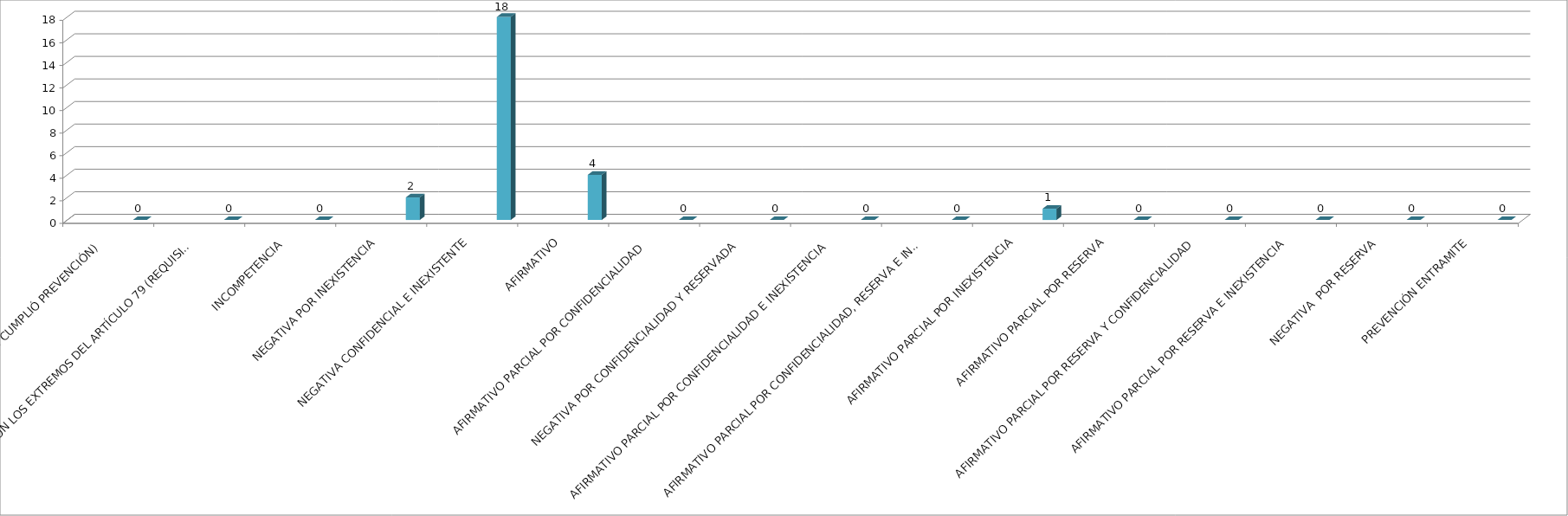
| Category | Series 0 | Series 1 | Series 2 | Series 3 | Series 4 |
|---|---|---|---|---|---|
| SE TIENE POR NO PRESENTADA ( NO CUMPLIÓ PREVENCIÓN) |  |  |  |  | 0 |
| NO CUMPLIO CON LOS EXTREMOS DEL ARTÍCULO 79 (REQUISITOS) |  |  |  |  | 0 |
| INCOMPETENCIA  |  |  |  |  | 0 |
| NEGATIVA POR INEXISTENCIA |  |  |  |  | 2 |
| NEGATIVA CONFIDENCIAL E INEXISTENTE |  |  |  |  | 18 |
| AFIRMATIVO |  |  |  |  | 4 |
| AFIRMATIVO PARCIAL POR CONFIDENCIALIDAD  |  |  |  |  | 0 |
| NEGATIVA POR CONFIDENCIALIDAD Y RESERVADA |  |  |  |  | 0 |
| AFIRMATIVO PARCIAL POR CONFIDENCIALIDAD E INEXISTENCIA |  |  |  |  | 0 |
| AFIRMATIVO PARCIAL POR CONFIDENCIALIDAD, RESERVA E INEXISTENCIA |  |  |  |  | 0 |
| AFIRMATIVO PARCIAL POR INEXISTENCIA |  |  |  |  | 1 |
| AFIRMATIVO PARCIAL POR RESERVA |  |  |  |  | 0 |
| AFIRMATIVO PARCIAL POR RESERVA Y CONFIDENCIALIDAD |  |  |  |  | 0 |
| AFIRMATIVO PARCIAL POR RESERVA E INEXISTENCIA |  |  |  |  | 0 |
| NEGATIVA  POR RESERVA |  |  |  |  | 0 |
| PREVENCIÓN ENTRAMITE |  |  |  |  | 0 |